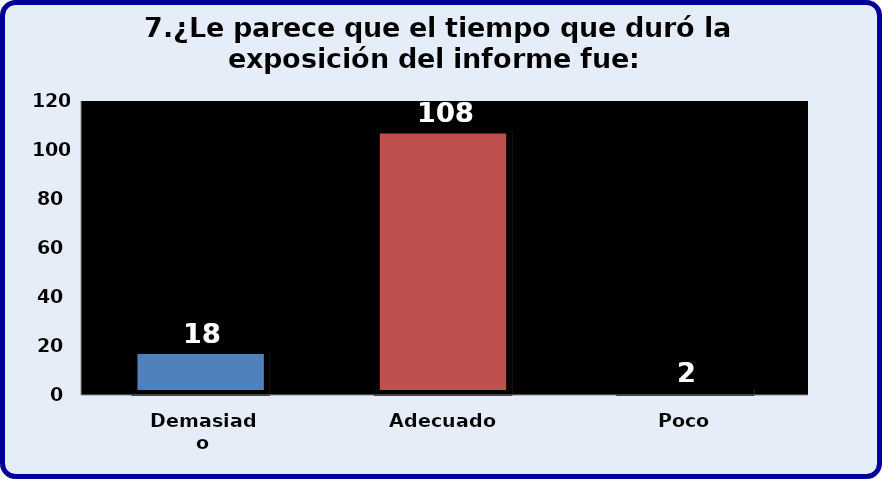
| Category | Series 0 |
|---|---|
| Demasiado | 18 |
| Adecuado | 108 |
| Poco | 2 |